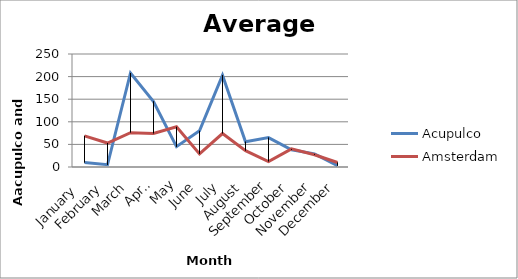
| Category | Acupulco | Amsterdam |
|---|---|---|
| January  | 10 | 69 |
| February | 5 | 53 |
| March | 208 | 76 |
| April | 145 | 74 |
| May | 45 | 89 |
| June | 80 | 29 |
| July | 203 | 74 |
| August | 56 | 36 |
| September | 65 | 12 |
| October | 38 | 40 |
| November | 29 | 27 |
| December | 3 | 10 |